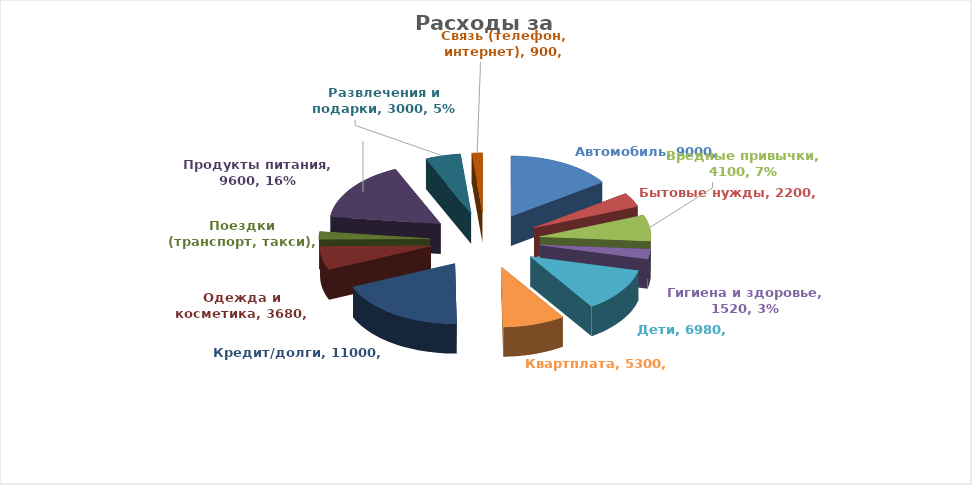
| Category | Series 3 | Series 0 | Series 1 | Series 2 |
|---|---|---|---|---|
| Автомобиль | 9000 |  |  | 9000 |
| Бытовые нужды | 2200 |  |  | 2200 |
| Вредные привычки | 4100 |  |  | 4100 |
| Гигиена и здоровье | 1520 |  |  | 1520 |
| Дети | 6980 |  |  | 6980 |
| Квартплата | 5300 |  |  | 5300 |
| Кредит/долги | 11000 |  |  | 11000 |
| Одежда и косметика | 3680 |  |  | 3680 |
| Поездки (транспорт, такси) | 1200 |  |  | 1200 |
| Продукты питания | 9600 |  |  | 9600 |
| Развлечения и подарки | 3000 |  |  | 3000 |
| Связь (телефон, интернет) | 900 |  |  | 900 |